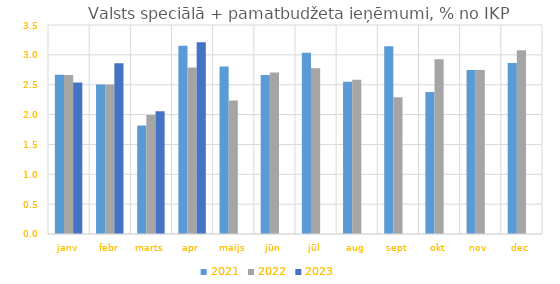
| Category | 2021 | 2022 | 2023 |
|---|---|---|---|
| janv | 2.665 | 2.663 | 2.536 |
| febr | 2.506 | 2.505 | 2.859 |
| marts | 1.818 | 1.992 | 2.054 |
| apr | 3.152 | 2.788 | 3.21 |
| maijs | 2.807 | 2.236 | 0 |
| jūn | 2.662 | 2.703 | 0 |
| jūl | 3.036 | 2.775 | 0 |
| aug | 2.551 | 2.583 | 0 |
| sept | 3.146 | 2.288 | 0 |
| okt | 2.38 | 2.928 | 0 |
| nov | 2.748 | 2.745 | 0 |
| dec | 2.862 | 3.075 | 0 |